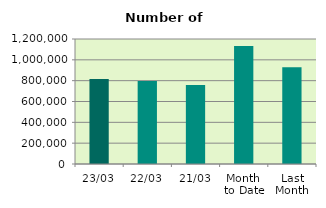
| Category | Series 0 |
|---|---|
| 23/03 | 816202 |
| 22/03 | 797876 |
| 21/03 | 759030 |
| Month 
to Date | 1133932.471 |
| Last
Month | 928647.7 |